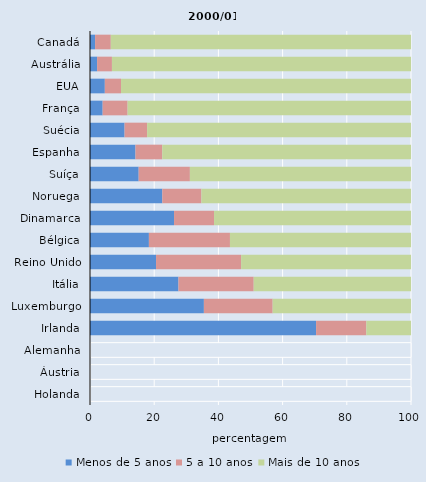
| Category | Menos de 5 anos | 5 a 10 anos | Mais de 10 anos |
|---|---|---|---|
| Canadá | 1.589 | 4.89 | 93.521 |
| Austrália | 2.214 | 4.621 | 93.165 |
| EUA | 4.618 | 5.048 | 90.334 |
| França | 3.944 | 7.772 | 88.284 |
| Suécia | 10.769 | 7.033 | 82.198 |
| Espanha | 14.162 | 8.346 | 77.492 |
| Suíça | 15.165 | 15.954 | 68.882 |
| Noruega | 22.527 | 12.177 | 65.297 |
| Dinamarca | 26.183 | 12.461 | 61.356 |
| Bélgica | 18.35 | 25.25 | 56.4 |
| Reino Unido | 20.575 | 26.501 | 52.924 |
| Itália | 27.56 | 23.441 | 48.999 |
| Luxemburgo | 35.479 | 21.426 | 43.095 |
| Irlanda | 70.435 | 15.652 | 13.913 |
| Alemanha | 100 | 0 | 0 |
| Áustria | 100 | 0 | 0 |
| Holanda | 100 | 0 | 0 |